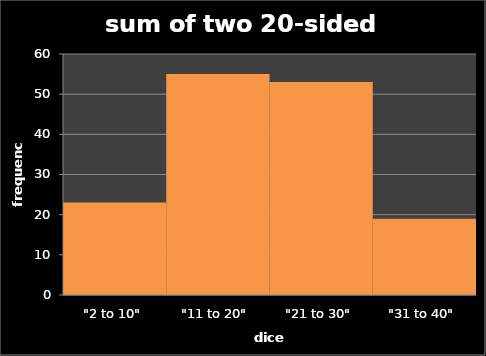
| Category | freq1 |
|---|---|
| "2 to 10" | 23 |
| "11 to 20" | 55 |
| "21 to 30" | 53 |
| "31 to 40" | 19 |